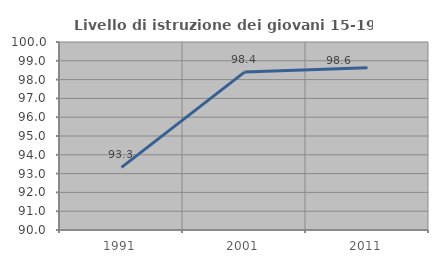
| Category | Livello di istruzione dei giovani 15-19 anni |
|---|---|
| 1991.0 | 93.333 |
| 2001.0 | 98.4 |
| 2011.0 | 98.636 |